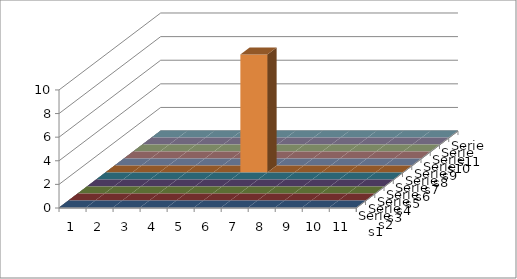
| Category | Series 0 | Series 1 | Series 2 | Series 3 | Series 4 | Series 5 | Series 6 | Series 7 | Series 8 | Series 9 | Series 10 |
|---|---|---|---|---|---|---|---|---|---|---|---|
| 0 | 0 | 0 | 0 | 0 | 0 | 0 | 0 | 0 | 0 | 0 | 0 |
| 1 | 0 | 0 | 0 | 0 | 0 | 0 | 0 | 0 | 0 | 0 | 0 |
| 2 | 0 | 0 | 0 | 0 | 0 | 0 | 0 | 0 | 0 | 0 | 0 |
| 3 | 0 | 0 | 0 | 0 | 0 | 0 | 0 | 0 | 0 | 0 | 0 |
| 4 | 0 | 0 | 0 | 0 | 0 | 0 | 0 | 0 | 0 | 0 | 0 |
| 5 | 0 | 0 | 0 | 0 | 0 | 10 | 0 | 0 | 0 | 0 | 0 |
| 6 | 0 | 0 | 0 | 0 | 0 | 0 | 0 | 0 | 0 | 0 | 0 |
| 7 | 0 | 0 | 0 | 0 | 0 | 0 | 0 | 0 | 0 | 0 | 0 |
| 8 | 0 | 0 | 0 | 0 | 0 | 0 | 0 | 0 | 0 | 0 | 0 |
| 9 | 0 | 0 | 0 | 0 | 0 | 0 | 0 | 0 | 0 | 0 | 0 |
| 10 | 0 | 0 | 0 | 0 | 0 | 0 | 0 | 0 | 0 | 0 | 0 |